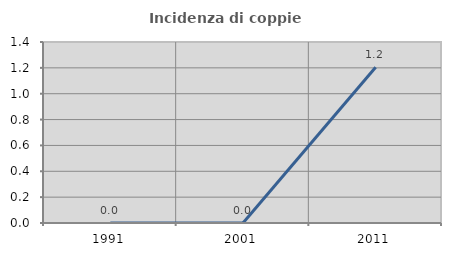
| Category | Incidenza di coppie miste |
|---|---|
| 1991.0 | 0 |
| 2001.0 | 0 |
| 2011.0 | 1.205 |